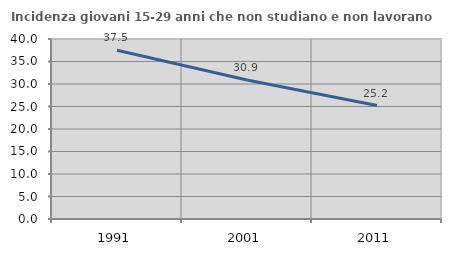
| Category | Incidenza giovani 15-29 anni che non studiano e non lavorano  |
|---|---|
| 1991.0 | 37.5 |
| 2001.0 | 30.888 |
| 2011.0 | 25.213 |